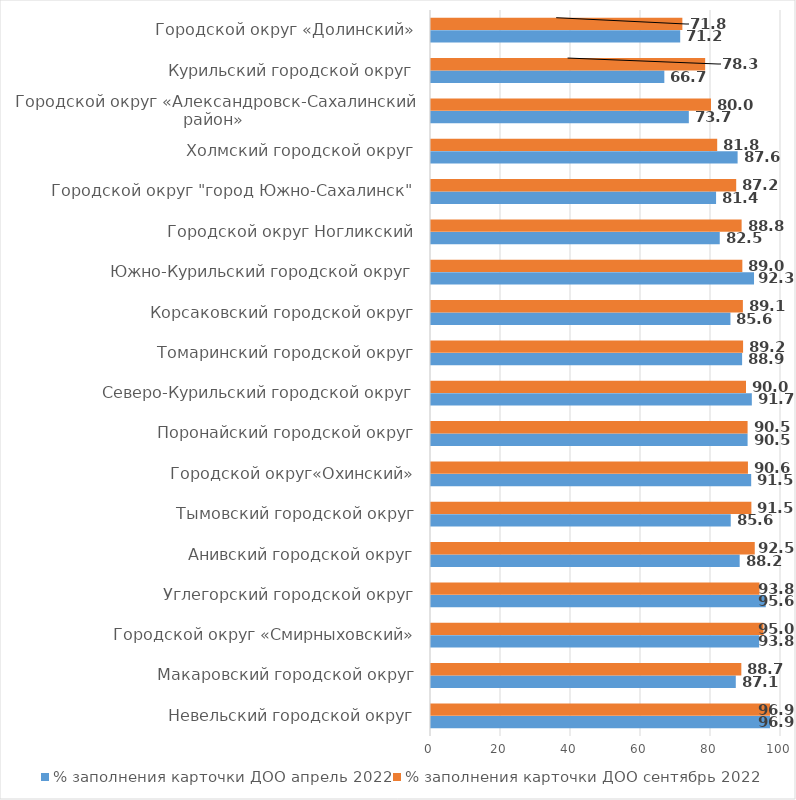
| Category | % заполнения карточки ДОО апрель 2022 | % заполнения карточки ДОО сентябрь 2022 |
|---|---|---|
| Невельский городской округ | 96.852 | 96.852 |
| Макаровский городской округ | 87.083 | 88.667 |
| Городской округ «Смирныховский» | 93.75 | 95 |
| Углегорский городской округ | 95.641 | 93.846 |
| Анивский городской округ | 88.194 | 92.5 |
| Тымовский городской округ | 85.641 | 91.538 |
| Городской округ«Охинский» | 91.481 | 90.556 |
| Поронайский городской округ | 90.455 | 90.455 |
| Северо-Курильский городской округ | 91.667 | 90 |
| Томаринский городской округ | 88.889 | 89.167 |
| Корсаковский городской округ | 85.556 | 89.111 |
| Южно-Курильский городской округ | 92.292 | 88.958 |
| Городской округ Ногликский | 82.5 | 88.75 |
| Городской округ "город Южно-Сахалинск" | 81.447 | 87.201 |
| Холмский городской округ | 87.604 | 81.771 |
| Городской округ «Александровск-Сахалинский район»  | 73.667 | 80 |
| Курильский городской округ | 66.667 | 78.333 |
| Городской округ «Долинский» | 71.2 | 71.818 |